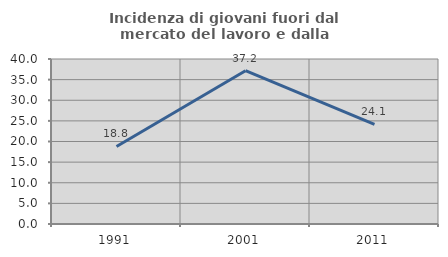
| Category | Incidenza di giovani fuori dal mercato del lavoro e dalla formazione  |
|---|---|
| 1991.0 | 18.803 |
| 2001.0 | 37.171 |
| 2011.0 | 24.149 |